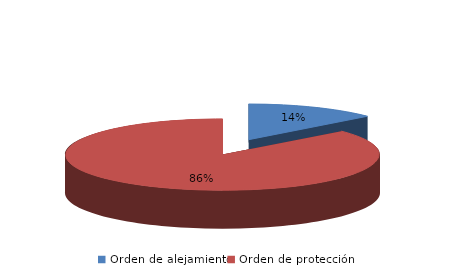
| Category | Series 0 |
|---|---|
| Orden de alejamiento | 65 |
| Orden de protección | 413 |